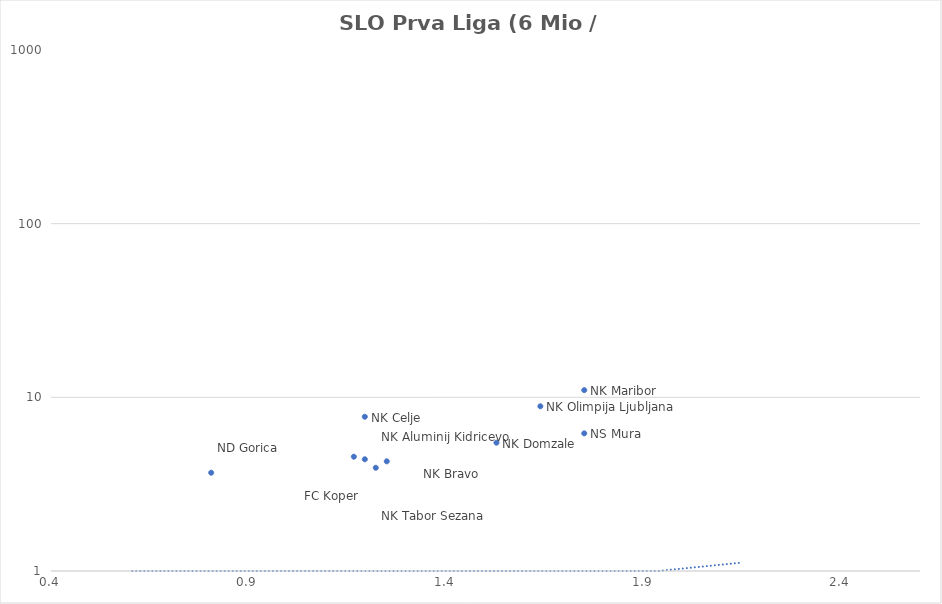
| Category | Series 0 |
|---|---|
| 1.75 | 6.2 |
| 1.75 | 11 |
| 1.6388888888888888 | 8.88 |
| 1.5277777777777777 | 5.48 |
| 1.25 | 4.28 |
| 1.2222222222222223 | 3.93 |
| 1.1944444444444444 | 4.4 |
| 1.1944444444444444 | 7.73 |
| 1.1666666666666667 | 4.55 |
| 0.8055555555555556 | 3.68 |